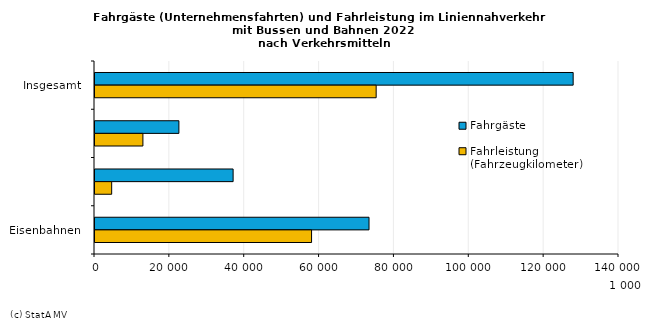
| Category | Fahrgäste | Fahrleistung (Fahrzeugkilometer) |
|---|---|---|
| Insgesamt | 127753 | 75121 |
| Eisenbahnen | 22416 | 12803 |
| Straßenbahnen | 36901 | 4456 |
| Omnibussen | 73213 | 57862 |